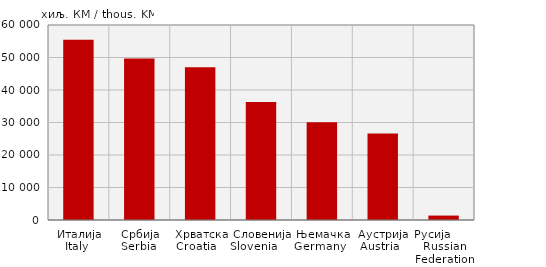
| Category | Извоз
Export |
|---|---|
| Италија
Italy  | 55449 |
| Србија
Serbia  | 49726 |
| Хрватска
Croatia    | 47022 |
| Словенија
Slovenia            | 36306 |
| Њемачка
Germany   | 30075 |
| Аустрија
Austria   | 26642 |
| Русија        Russian Federation | 1363 |